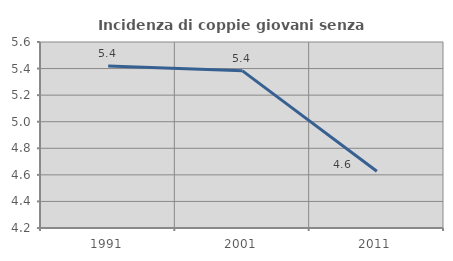
| Category | Incidenza di coppie giovani senza figli |
|---|---|
| 1991.0 | 5.418 |
| 2001.0 | 5.383 |
| 2011.0 | 4.627 |